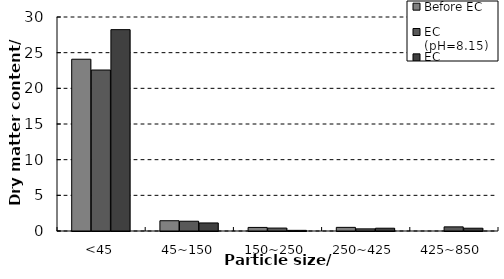
| Category | Before EC | EC (pH=8.15) | EC (pH=6.02) |
|---|---|---|---|
| <45 | 24.08 | 22.57 | 28.23 |
| 45~150 | 1.44 | 1.37 | 1.13 |
| 150~250 | 0.5 | 0.41 | 0.09 |
| 250~425 | 0.51 | 0.3 | 0.39 |
| 425~850 | 0 | 0.58 | 0.39 |